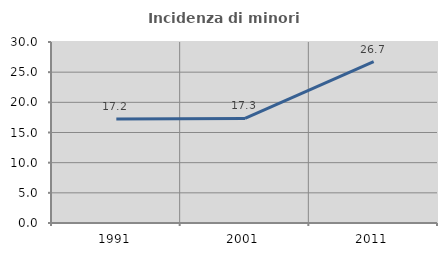
| Category | Incidenza di minori stranieri |
|---|---|
| 1991.0 | 17.241 |
| 2001.0 | 17.333 |
| 2011.0 | 26.728 |